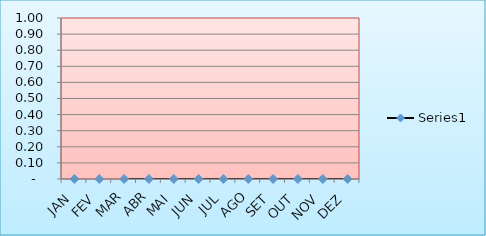
| Category | Series 0 |
|---|---|
| JAN | 0 |
| FEV | 0 |
| MAR | 0 |
| ABR | 0 |
| MAI | 0 |
| JUN | 0 |
| JUL | 0 |
| AGO | 0 |
| SET | 0 |
| OUT | 0 |
| NOV | 0 |
| DEZ | 0 |